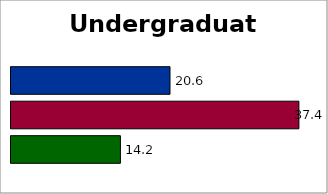
| Category | Series 2 | SREB states | 50 states and D.C. |
|---|---|---|---|
| 0 | 14.209 | 37.39 | 20.648 |